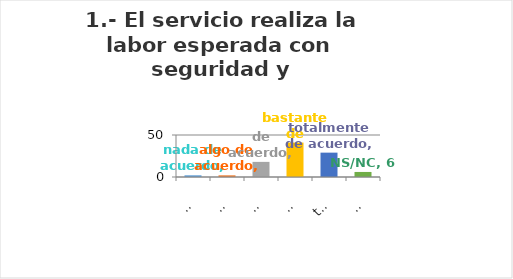
| Category | Series 0 |
|---|---|
| nada de acuerdo | 2 |
| algo de acuerdo | 2 |
| de acuerdo | 18 |
| bastante de acuerdo | 41 |
| totalmente de acuerdo | 29 |
| NS/NC | 6 |